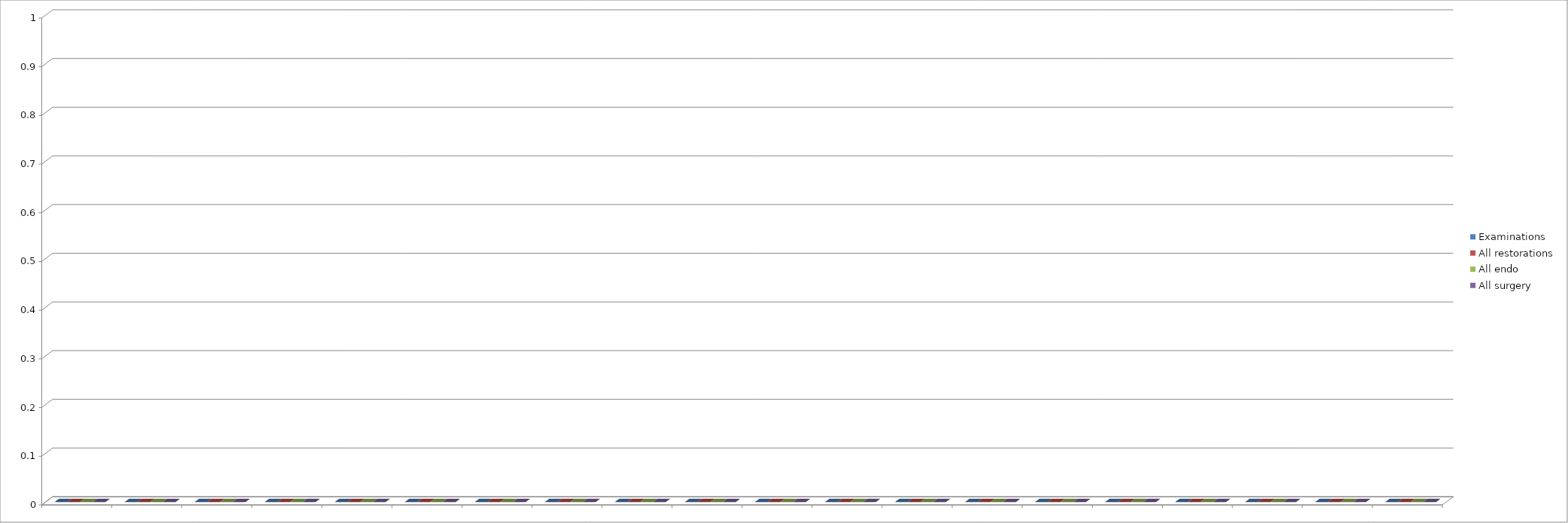
| Category | Examinations | All restorations | All endo | All surgery |
|---|---|---|---|---|
| 0 | 0 | 0 | 0 | 0 |
| 1 | 0 | 0 | 0 | 0 |
| 2 | 0 | 0 | 0 | 0 |
| 3 | 0 | 0 | 0 | 0 |
| 4 | 0 | 0 | 0 | 0 |
| 5 | 0 | 0 | 0 | 0 |
| 6 | 0 | 0 | 0 | 0 |
| 7 | 0 | 0 | 0 | 0 |
| 8 | 0 | 0 | 0 | 0 |
| 9 | 0 | 0 | 0 | 0 |
| 10 | 0 | 0 | 0 | 0 |
| 11 | 0 | 0 | 0 | 0 |
| 12 | 0 | 0 | 0 | 0 |
| 13 | 0 | 0 | 0 | 0 |
| 14 | 0 | 0 | 0 | 0 |
| 15 | 0 | 0 | 0 | 0 |
| 16 | 0 | 0 | 0 | 0 |
| 17 | 0 | 0 | 0 | 0 |
| 18 | 0 | 0 | 0 | 0 |
| 19 | 0 | 0 | 0 | 0 |